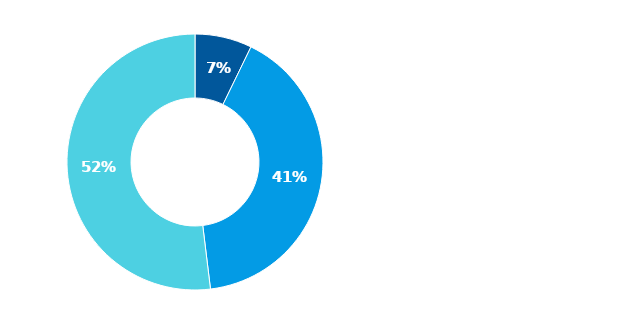
| Category | Series 0 |
|---|---|
| Hotovost | 0.072 |
| Půjčky poskytnuté nemovitostní společnosti | 0.409 |
| Majetkové účasti v nemovitostní společnosti | 0.519 |